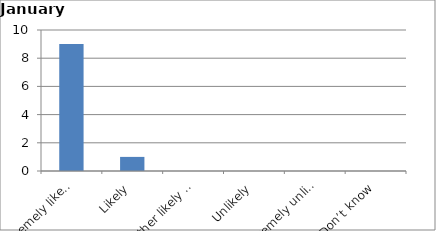
| Category | Series 0 |
|---|---|
| Extremely likely | 9 |
| Likely | 1 |
| Neither likely nor unlikely | 0 |
| Unlikely | 0 |
| Extremely unlikely | 0 |
| Don’t know | 0 |